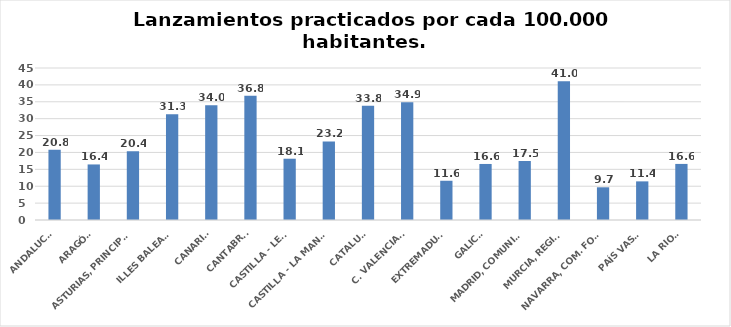
| Category | Series 0 |
|---|---|
| ANDALUCÍA | 20.776 |
| ARAGÓN | 16.448 |
| ASTURIAS, PRINCIPADO | 20.365 |
| ILLES BALEARS | 31.305 |
| CANARIAS | 33.988 |
| CANTABRIA | 36.796 |
| CASTILLA - LEÓN | 18.141 |
| CASTILLA - LA MANCHA | 23.245 |
| CATALUÑA | 33.828 |
| C. VALENCIANA | 34.856 |
| EXTREMADURA | 11.617 |
| GALICIA | 16.591 |
| MADRID, COMUNIDAD | 17.463 |
| MURCIA, REGIÓN | 41.043 |
| NAVARRA, COM. FORAL | 9.682 |
| PAÍS VASCO | 11.435 |
| LA RIOJA | 16.603 |